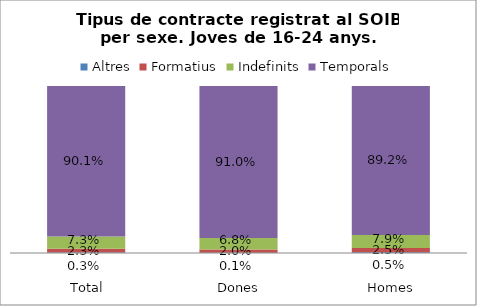
| Category | Altres | Formatius | Indefinits | Temporals |
|---|---|---|---|---|
| 
Total | 0.003 | 0.023 | 0.073 | 0.901 |
| 
Dones | 0.001 | 0.02 | 0.068 | 0.91 |
| 
Homes | 0.005 | 0.025 | 0.079 | 0.892 |